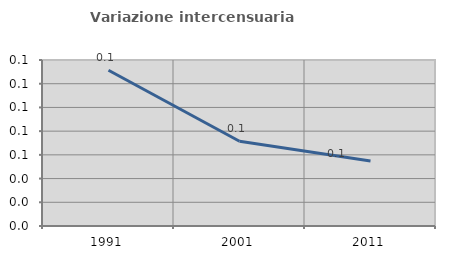
| Category | Variazione intercensuaria annua |
|---|---|
| 1991.0 | 0.131 |
| 2001.0 | 0.071 |
| 2011.0 | 0.055 |